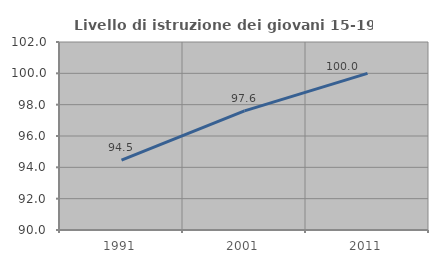
| Category | Livello di istruzione dei giovani 15-19 anni |
|---|---|
| 1991.0 | 94.466 |
| 2001.0 | 97.605 |
| 2011.0 | 100 |